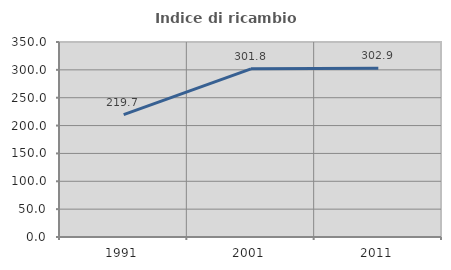
| Category | Indice di ricambio occupazionale  |
|---|---|
| 1991.0 | 219.672 |
| 2001.0 | 301.786 |
| 2011.0 | 302.899 |